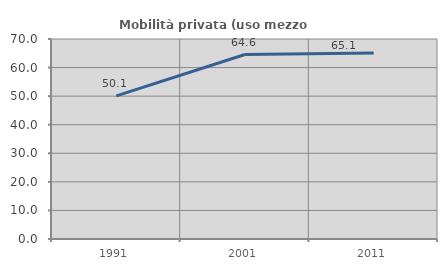
| Category | Mobilità privata (uso mezzo privato) |
|---|---|
| 1991.0 | 50.087 |
| 2001.0 | 64.573 |
| 2011.0 | 65.102 |